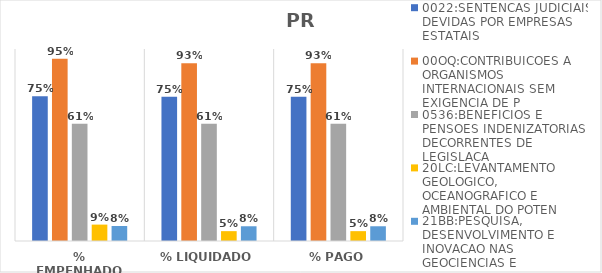
| Category | 0022:SENTENCAS JUDICIAIS DEVIDAS POR EMPRESAS ESTATAIS | 00OQ:CONTRIBUICOES A ORGANISMOS INTERNACIONAIS SEM EXIGENCIA DE P | 0536:BENEFICIOS E PENSOES INDENIZATORIAS DECORRENTES DE LEGISLACA | 20LC:LEVANTAMENTO GEOLOGICO, OCEANOGRAFICO E AMBIENTAL DO POTEN | 21BB:PESQUISA, DESENVOLVIMENTO E INOVACAO NAS GEOCIENCIAS E |
|---|---|---|---|---|---|
| % EMPENHADO | 0.754 | 0.95 | 0.611 | 0.085 | 0.078 |
| % LIQUIDADO | 0.751 | 0.926 | 0.611 | 0.051 | 0.077 |
| % PAGO | 0.751 | 0.926 | 0.611 | 0.051 | 0.077 |